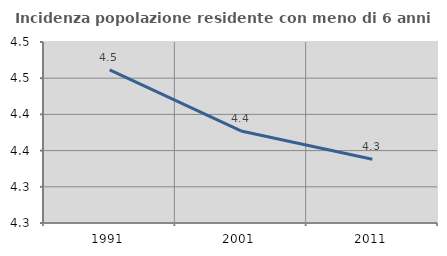
| Category | Incidenza popolazione residente con meno di 6 anni |
|---|---|
| 1991.0 | 4.461 |
| 2001.0 | 4.377 |
| 2011.0 | 4.338 |